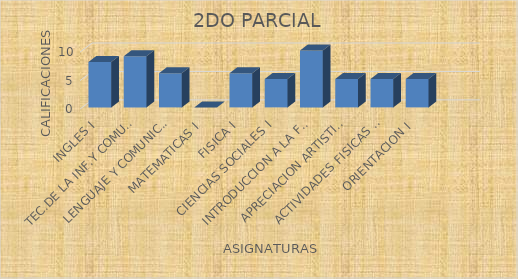
| Category | 2DO PARCIAL |
|---|---|
| INGLES I | 8 |
| TEC.DE LA INF.Y COMUNICACION I | 9 |
| LENGUAJE Y COMUNICACION I | 6 |
| MATEMATICAS I | 0 |
| FISICA I | 6 |
| CIENCIAS SOCIALES I | 5 |
| INTRODUCCION A LA FILOSOFIA | 10 |
| APRECIACION ARTISTICA I | 5 |
| ACTIVIDADES FISICAS Y DEPORTIVAS I | 5 |
| ORIENTACION I | 5 |